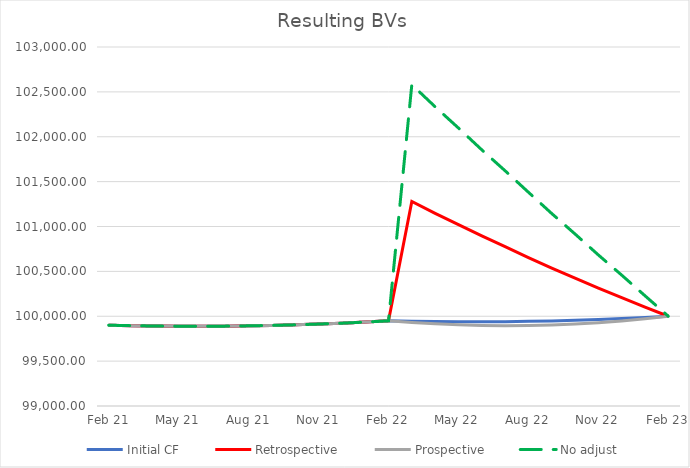
| Category | Initial CF | Retrospective | Prospective | No adjust |
|---|---|---|---|---|
| 2021-02-01 | 99900.001 | 99900.001 | 99900.001 | 99900.001 |
| 2021-03-01 | 99894.99 | 99894.988 | 99894.99 | 99894.99 |
| 2021-04-01 | 99891.11 | 99891.111 | 99891.11 | 99891.11 |
| 2021-05-01 | 99889.04 | 99889.042 | 99889.04 | 99889.04 |
| 2021-06-01 | 99888.64 | 99888.644 | 99888.64 | 99888.64 |
| 2021-07-01 | 99889.96 | 99889.955 | 99889.96 | 99889.96 |
| 2021-08-01 | 99893.08 | 99893.078 | 99893.08 | 99893.08 |
| 2021-09-01 | 99897.99 | 99897.99 | 99897.99 | 99897.99 |
| 2021-10-01 | 99904.45 | 99904.452 | 99904.45 | 99904.45 |
| 2021-11-01 | 99912.91 | 99912.914 | 99912.91 | 99912.91 |
| 2021-12-01 | 99922.84 | 99922.835 | 99922.84 | 99922.84 |
| 2022-01-01 | 99934.89 | 99934.888 | 99934.89 | 99934.89 |
| 2022-02-01 | 99948.77 | 99948.77 | 99948.77 | 99948.77 |
| 2022-03-01 | 99943.94 | 101279.071 | 99930.85 | 102580.3 |
| 2022-04-01 | 99940.27 | 101146.679 | 99915.16 | 102333.87 |
| 2022-05-01 | 99938.4 | 101021.355 | 99904.15 | 102097.11 |
| 2022-06-01 | 99938.21 | 100894.763 | 99897.1 | 101854.25 |
| 2022-07-01 | 99939.73 | 100775.079 | 99894.51 | 101620.98 |
| 2022-08-01 | 99943.05 | 100654.347 | 99896.23 | 101381.74 |
| 2022-09-01 | 99948.17 | 100536.605 | 99902.44 | 101144.34 |
| 2022-10-01 | 99954.84 | 100425.54 | 99912.77 | 100916.37 |
| 2022-11-01 | 99963.51 | 100313.748 | 99927.92 | 100682.63 |
| 2022-12-01 | 99973.65 | 100208.474 | 99946.94 | 100458.21 |
| 2023-01-01 | 99985.91 | 100102.692 | 99971.15 | 100228.16 |
| 2023-02-01 | 100000 | 100000 | 100000 | 100000 |